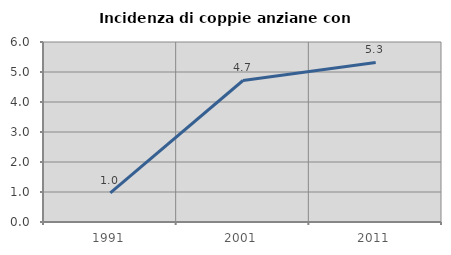
| Category | Incidenza di coppie anziane con figli |
|---|---|
| 1991.0 | 0.971 |
| 2001.0 | 4.717 |
| 2011.0 | 5.319 |